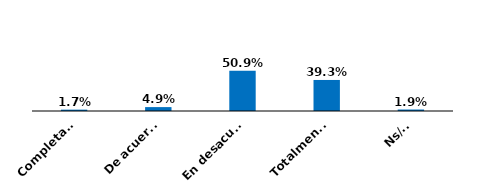
| Category | Series 0 |
|---|---|
| Completamente de acuerdo | 0.017 |
| De acuerdo | 0.049 |
| En desacuerdo | 0.509 |
| Totalmente en desacuerdo | 0.393 |
| Ns/Nr | 0.019 |